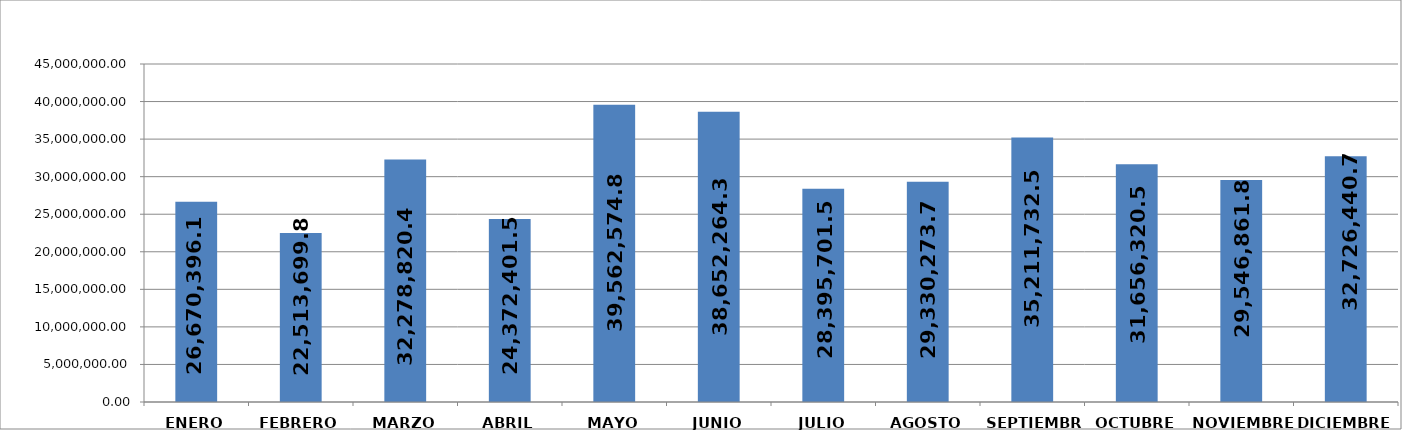
| Category | Series 0 |
|---|---|
| ENERO | 26670396.16 |
| FEBRERO | 22513699.85 |
| MARZO | 32278820.49 |
| ABRIL | 24372401.56 |
| MAYO | 39562574.82 |
| JUNIO | 38652264.32 |
| JULIO | 28395701.58 |
| AGOSTO | 29330273.78 |
| SEPTIEMBRE | 35211732.5 |
| OCTUBRE | 31656320.56 |
| NOVIEMBRE | 29546861.8 |
| DICIEMBRE | 32726440.71 |